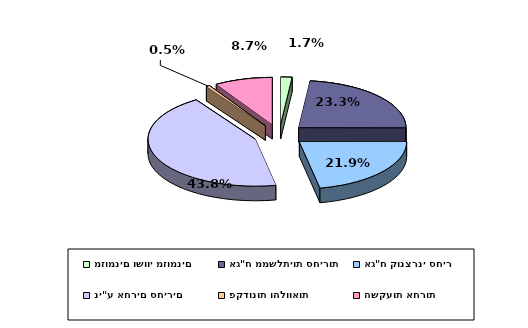
| Category | Series 0 |
|---|---|
| מזומנים ושווי מזומנים | 0.017 |
| אג"ח ממשלתיות סחירות | 0.233 |
| אג"ח קונצרני סחיר | 0.219 |
| ני"ע אחרים סחירים | 0.438 |
| פקדונות והלוואות | 0.005 |
| השקעות אחרות | 0.087 |